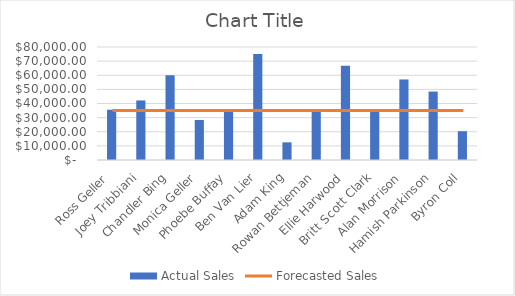
| Category |  Actual Sales  |
|---|---|
| Ross Geller | 35600 |
| Joey Tribbiani | 42150 |
| Chandler Bing | 60000 |
| Monica Geller | 28300 |
| Phoebe Buffay | 34500 |
| Ben Van Lier | 75000 |
| Adam King | 12500 |
| Rowan Bettjeman | 35623 |
| Ellie Harwood | 66785 |
| Britt Scott Clark | 35430 |
| Alan Morrison | 57020 |
| Hamish Parkinson | 48456 |
| Byron Coll | 20400 |